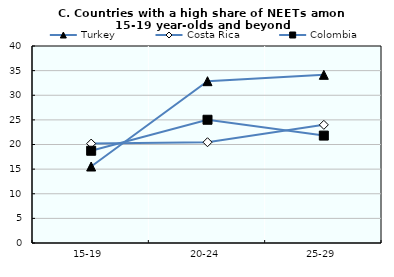
| Category | Turkey | Costa Rica | Colombia |
|---|---|---|---|
| 15-19 | 15.53 | 20.187 | 18.728 |
| 20-24 | 32.858 | 20.461 | 25.023 |
| 25-29 | 34.149 | 23.993 | 21.808 |